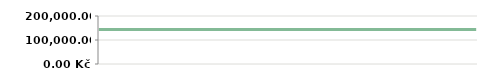
| Category | ROK   |
|---|---|
| 2013-04-23 | 143800 |
| 2013-04-25 | 143800 |
| 2013-05-07 | 143800 |
| 2013-05-14 | 143800 |
| 2013-05-14 | 143800 |
| 2013-05-29 | 143800 |
| 2013-06-10 | 143800 |
| 2013-06-21 | 143800 |
| 2013-07-06 | 143800 |
| 2013-08-05 | 143800 |
| 2013-08-19 | 143800 |
| 2013-09-04 | 143800 |
| 2013-09-20 | 143800 |
| 2013-09-25 | 143800 |
| 2013-10-15 | 143800 |
| 2013-11-05 | 143800 |
| 2013-11-26 | 143800 |
| 2013-11-30 | 143800 |
| 2013-12-11 | 143800 |